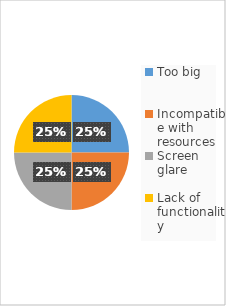
| Category | Series 0 |
|---|---|
| Too big | 2 |
| Incompatible with resources | 2 |
| Screen glare | 2 |
| Lack of functionality | 2 |